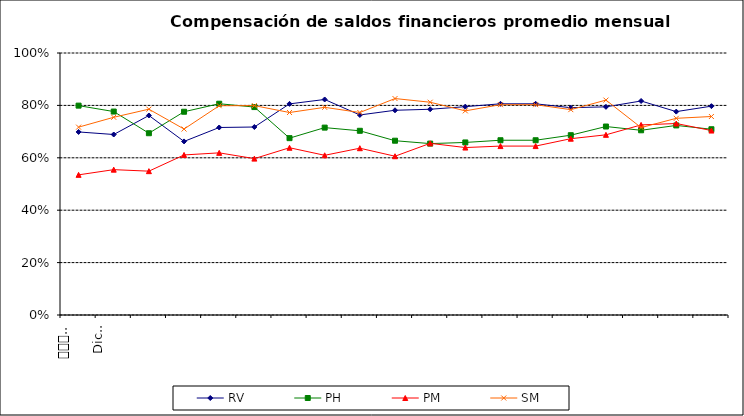
| Category | RV | PH | PM | SM |
|---|---|---|---|---|
| 0 | 0.699 | 0.799 | 0.535 | 0.717 |
| 1 | 0.689 | 0.776 | 0.555 | 0.755 |
| 2 | 0.762 | 0.694 | 0.549 | 0.786 |
| 3 | 0.662 | 0.776 | 0.611 | 0.71 |
| 4 | 0.716 | 0.806 | 0.619 | 0.799 |
| 5 | 0.718 | 0.794 | 0.597 | 0.799 |
| 6 | 0.806 | 0.675 | 0.638 | 0.773 |
| 7 | 0.823 | 0.715 | 0.61 | 0.793 |
| 8 | 0.764 | 0.703 | 0.637 | 0.773 |
| 9 | 0.781 | 0.665 | 0.606 | 0.826 |
| 10 | 0.785 | 0.654 | 0.655 | 0.812 |
| 11 | 0.795 | 0.659 | 0.639 | 0.779 |
| 12 | 0.806 | 0.667 | 0.645 | 0.803 |
| 13 | 0.806 | 0.667 | 0.645 | 0.803 |
| 14 | 0.791 | 0.686 | 0.673 | 0.784 |
| 15 | 0.794 | 0.719 | 0.688 | 0.82 |
| 16 | 0.817 | 0.705 | 0.726 | 0.715 |
| 17 | 0.776 | 0.724 | 0.731 | 0.751 |
| 18 | 0.797 | 0.709 | 0.704 | 0.758 |